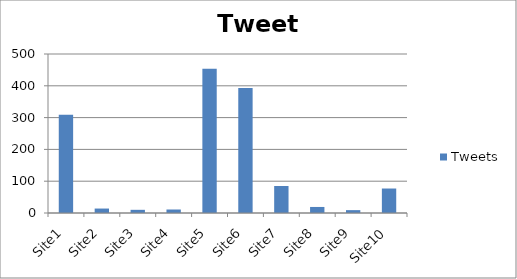
| Category | Tweets |
|---|---|
| Site1 | 309 |
| Site2 | 14 |
| Site3 | 10 |
| Site4 | 11 |
| Site5 | 454 |
| Site6 | 393 |
| Site7 | 85 |
| Site8 | 19 |
| Site9 | 9 |
| Site10 | 77 |